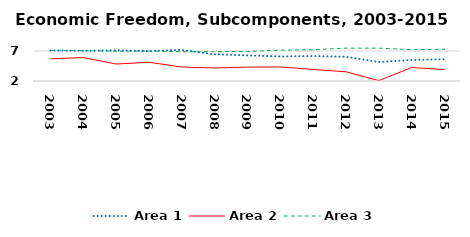
| Category | Area 1 | Area 2 | Area 3 |
|---|---|---|---|
| 2003.0 | 7.086 | 5.706 | 7.066 |
| 2004.0 | 7.039 | 5.901 | 7.076 |
| 2005.0 | 7.106 | 4.827 | 6.961 |
| 2006.0 | 6.992 | 5.123 | 6.997 |
| 2007.0 | 7.179 | 4.324 | 6.875 |
| 2008.0 | 6.456 | 4.177 | 6.869 |
| 2009.0 | 6.269 | 4.313 | 6.933 |
| 2010.0 | 6.09 | 4.338 | 7.136 |
| 2011.0 | 6.161 | 3.92 | 7.216 |
| 2012.0 | 6.032 | 3.534 | 7.473 |
| 2013.0 | 5.16 | 2.064 | 7.481 |
| 2014.0 | 5.503 | 4.246 | 7.216 |
| 2015.0 | 5.619 | 3.901 | 7.296 |